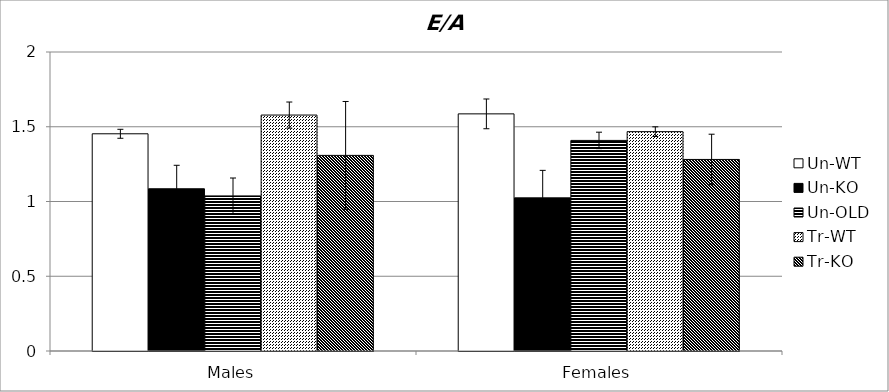
| Category | Un-WT | Un-KO | Un-OLD | Tr-WT | Tr-KO |
|---|---|---|---|---|---|
| 0 | 1.453 | 1.085 | 1.037 | 1.578 | 1.309 |
| 1 | 1.586 | 1.024 | 1.409 | 1.467 | 1.281 |